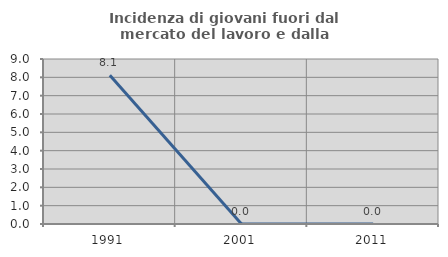
| Category | Incidenza di giovani fuori dal mercato del lavoro e dalla formazione  |
|---|---|
| 1991.0 | 8.108 |
| 2001.0 | 0 |
| 2011.0 | 0 |